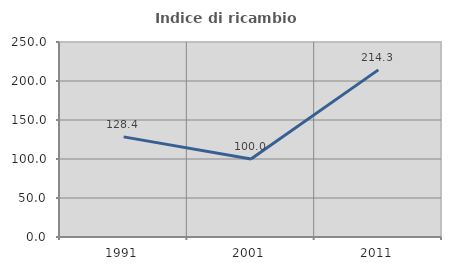
| Category | Indice di ricambio occupazionale  |
|---|---|
| 1991.0 | 128.358 |
| 2001.0 | 100 |
| 2011.0 | 214.286 |